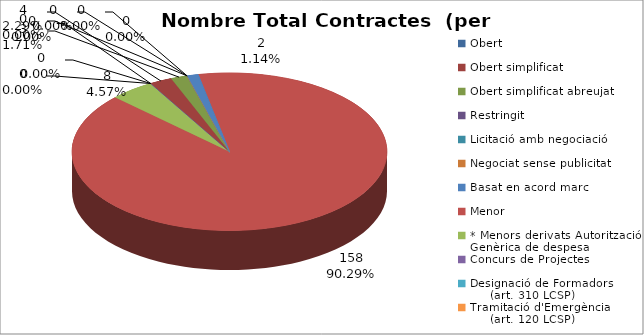
| Category | Nombre Total Contractes |
|---|---|
| Obert | 0 |
| Obert simplificat | 4 |
| Obert simplificat abreujat | 3 |
| Restringit | 0 |
| Licitació amb negociació | 0 |
| Negociat sense publicitat | 0 |
| Basat en acord marc | 2 |
| Menor | 158 |
| * Menors derivats Autorització Genèrica de despesa | 8 |
| Concurs de Projectes | 0 |
| Designació de Formadors
     (art. 310 LCSP) | 0 |
| Tramitació d'Emergència
     (art. 120 LCSP) | 0 |